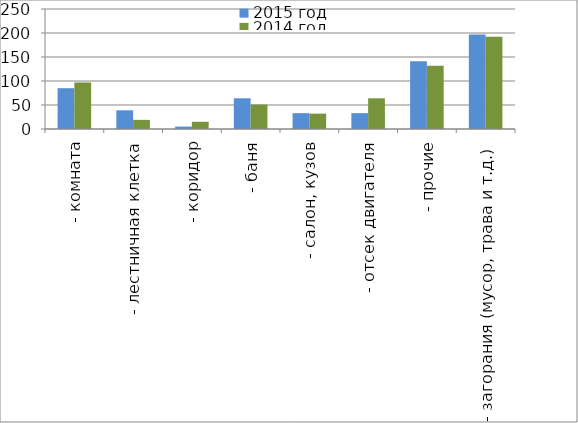
| Category | 2015 год | 2014 год |
|---|---|---|
|  - комната | 85 | 97 |
|  - лестничная клетка | 39 | 19 |
|  - коридор | 5 | 15 |
|  - баня | 64 | 51 |
|  - салон, кузов | 33 | 32 |
|  - отсек двигателя | 33 | 64 |
| - прочие | 141 | 132 |
| - загорания (мусор, трава и т.д.)  | 197 | 192 |